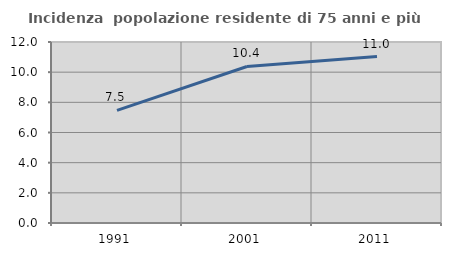
| Category | Incidenza  popolazione residente di 75 anni e più |
|---|---|
| 1991.0 | 7.468 |
| 2001.0 | 10.377 |
| 2011.0 | 11.032 |